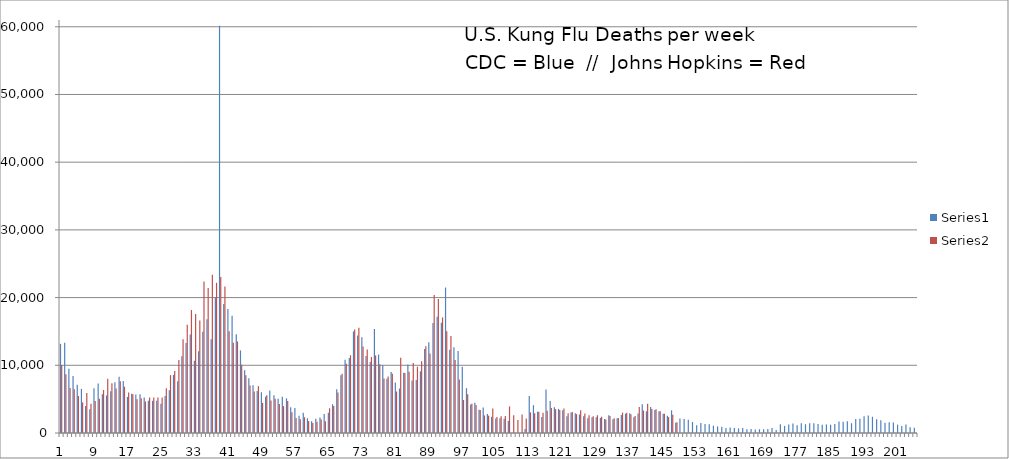
| Category | Series 0 | Series 1 |
|---|---|---|
| 0 | 13171 | 10026 |
| 1 | 13340 | 8682 |
| 2 | 9503 | 6630 |
| 3 | 8416 | 6480 |
| 4 | 7137 | 5473 |
| 5 | 6520 | 4498 |
| 6 | 3973 | 5924 |
| 7 | 3512 | 4336 |
| 8 | 6618 | 4713 |
| 9 | 7329 | 5048 |
| 10 | 5719 | 6345 |
| 11 | 5556 | 8028 |
| 12 | 6151 | 7341 |
| 13 | 7486 | 6575 |
| 14 | 8306 | 7647 |
| 15 | 7693 | 6838 |
| 16 | 5326 | 5993 |
| 17 | 5786 | 5708 |
| 18 | 5671 | 4970 |
| 19 | 5735 | 5116 |
| 20 | 5236 | 4642 |
| 21 | 4752 | 5241 |
| 22 | 4752 | 5241 |
| 23 | 4752 | 5241 |
| 24 | 4327 | 5227 |
| 25 | 5477 | 6620 |
| 26 | 6311 | 8543 |
| 27 | 8581 | 9154 |
| 28 | 7642 | 10783 |
| 29 | 11336 | 13842 |
| 30 | 13306 | 15973 |
| 31 | 14537 | 18163 |
| 32 | 10672 | 17573 |
| 33 | 12066 | 16616 |
| 34 | 14963 | 22361 |
| 35 | 16799 | 21426 |
| 36 | 13848 | 23388 |
| 37 | 20020 | 22182 |
| 38 | 60146 | 23026 |
| 39 | 19061 | 21655 |
| 40 | 18301 | 15023 |
| 41 | 17318 | 13337 |
| 42 | 14591 | 13519 |
| 43 | 12204 | 10075 |
| 44 | 9251 | 8542 |
| 45 | 8099 | 7013 |
| 46 | 7053 | 6114 |
| 47 | 6220 | 6924 |
| 48 | 6027 | 4442 |
| 49 | 5368 | 5566 |
| 50 | 6261 | 4814 |
| 51 | 5593 | 5055 |
| 52 | 5057 | 4292 |
| 53 | 5350 | 3973 |
| 54 | 5120 | 4735 |
| 55 | 3811 | 3073 |
| 56 | 3696 | 2199 |
| 57 | 2556 | 2039 |
| 58 | 2977 | 2335 |
| 59 | 2176 | 1774 |
| 60 | 1737 | 1493 |
| 61 | 2122 | 1649 |
| 62 | 2286 | 1980 |
| 63 | 2796 | 1748 |
| 64 | 2993 | 3656 |
| 65 | 4253 | 3977 |
| 66 | 6471 | 5967 |
| 67 | 8540 | 8760 |
| 68 | 10836 | 10241 |
| 69 | 11060 | 11487 |
| 70 | 15000 | 15274 |
| 71 | 14415 | 15556 |
| 72 | 14142 | 12770 |
| 73 | 11359 | 12323 |
| 74 | 10475 | 11214 |
| 75 | 15369 | 11453 |
| 76 | 11592 | 10168 |
| 77 | 10043 | 8035 |
| 78 | 8027 | 8361 |
| 79 | 8999 | 8738 |
| 80 | 7464 | 6124 |
| 81 | 6565 | 11104 |
| 82 | 8897 | 8847 |
| 83 | 10113 | 9039 |
| 84 | 7743 | 10341 |
| 85 | 7837 | 9799 |
| 86 | 9117 | 10600 |
| 87 | 12399 | 12818 |
| 88 | 13387 | 11752 |
| 89 | 16245 | 20391 |
| 90 | 17165 | 19799 |
| 91 | 16286 | 17069 |
| 92 | 21482 | 15012 |
| 93 | 12311 | 14336 |
| 94 | 12663 | 10783 |
| 95 | 12103 | 7912 |
| 96 | 9767 | 4878 |
| 97 | 6619 | 5723 |
| 98 | 4222 | 4330 |
| 99 | 4466 | 4137 |
| 100 | 3441 | 3408 |
| 101 | 3750 | 2597 |
| 102 | 2812 | 2557 |
| 103 | 2386 | 3615 |
| 104 | 2130 | 2373 |
| 105 | 2176 | 2468 |
| 106 | 2115 | 2497 |
| 107 | 1768 | 3928 |
| 108 | 0 | 2608 |
| 109 | 0 | 1907 |
| 110 | 0 | 2720 |
| 111 | 596 | 2153 |
| 112 | 5473 | 3051 |
| 113 | 4107 | 2906 |
| 114 | 3148 | 3135 |
| 115 | 2361 | 2999 |
| 116 | 6416 | 3276 |
| 117 | 4728 | 3709 |
| 118 | 3805 | 3514 |
| 119 | 3569 | 3391 |
| 120 | 3378 | 3634 |
| 121 | 2492 | 2910 |
| 122 | 3011 | 3099 |
| 123 | 2916 | 2787 |
| 124 | 2736 | 3345 |
| 125 | 2490 | 2891 |
| 126 | 2193 | 2630 |
| 127 | 2312 | 2473 |
| 128 | 2320 | 2623 |
| 129 | 2235 | 2401 |
| 130 | 2070 | 1984 |
| 131 | 2615 | 2497 |
| 132 | 2040 | 2162 |
| 133 | 2173 | 2230 |
| 134 | 2646 | 3013 |
| 135 | 2851 | 2973 |
| 136 | 2935 | 2752 |
| 137 | 2338 | 2503 |
| 138 | 2877 | 3827 |
| 139 | 4228 | 3309 |
| 140 | 3214 | 4314 |
| 141 | 3832 | 3531 |
| 142 | 3415 | 3494 |
| 143 | 3222 | 3226 |
| 144 | 2841 | 2846 |
| 145 | 2551 | 2346 |
| 146 | 3348 | 2706 |
| 147 | 1517 | 1584 |
| 148 | 2140 | 0 |
| 149 | 2068 | 0 |
| 150 | 1942 | 0 |
| 151 | 1627 | 0 |
| 152 | 1143 | 0 |
| 153 | 1462 | 0 |
| 154 | 1313 | 0 |
| 155 | 1298 | 0 |
| 156 | 1075 | 0 |
| 157 | 964 | 0 |
| 158 | 924 | 0 |
| 159 | 754 | 0 |
| 160 | 809 | 0 |
| 161 | 732 | 0 |
| 162 | 682 | 0 |
| 163 | 739 | 0 |
| 164 | 565 | 0 |
| 165 | 598 | 0 |
| 166 | 526 | 0 |
| 167 | 560 | 0 |
| 168 | 570 | 0 |
| 169 | 577 | 0 |
| 170 | 729 | 0 |
| 171 | 437 | 0 |
| 172 | 1275 | 0 |
| 173 | 1041 | 0 |
| 174 | 1267 | 0 |
| 175 | 1416 | 0 |
| 176 | 1142 | 0 |
| 177 | 1425 | 0 |
| 178 | 1297 | 0 |
| 179 | 1440 | 0 |
| 180 | 1429 | 0 |
| 181 | 1317 | 0 |
| 182 | 1213 | 0 |
| 183 | 1262 | 0 |
| 184 | 1235 | 0 |
| 185 | 1341 | 0 |
| 186 | 1703 | 0 |
| 187 | 1679 | 0 |
| 188 | 1740 | 0 |
| 189 | 1439 | 0 |
| 190 | 2082 | 0 |
| 191 | 2097 | 0 |
| 192 | 2459 | 0 |
| 193 | 2570 | 0 |
| 194 | 2402 | 0 |
| 195 | 2017 | 0 |
| 196 | 1891 | 0 |
| 197 | 1519 | 0 |
| 198 | 1570 | 0 |
| 199 | 1544 | 0 |
| 200 | 1234 | 0 |
| 201 | 1040 | 0 |
| 202 | 1263 | 0 |
| 203 | 840 | 0 |
| 204 | 773 | 0 |